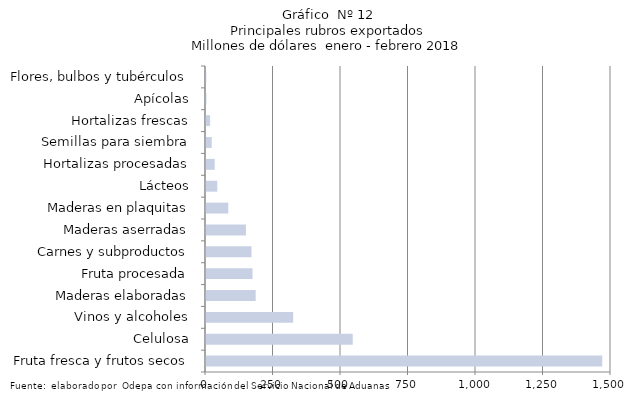
| Category | Series 7 |
|---|---|
| Fruta fresca y frutos secos | 1467509.524 |
| Celulosa | 543530.142 |
| Vinos y alcoholes | 322850.303 |
| Maderas elaboradas | 184008.473 |
| Fruta procesada | 172161.387 |
| Carnes y subproductos | 168508.152 |
| Maderas aserradas | 147933.137 |
| Maderas en plaquitas | 82474.247 |
| Lácteos | 41732.81 |
| Hortalizas procesadas | 32239.936 |
| Semillas para siembra | 21219.956 |
| Hortalizas frescas | 15215.721 |
| Apícolas | 1689.701 |
| Flores, bulbos y tubérculos | 1205.381 |